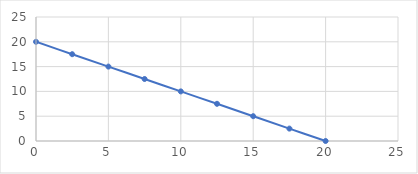
| Category | cereja |
|---|---|
| 20.0 | 0 |
| 17.5 | 2.5 |
| 15.0 | 5 |
| 12.5 | 7.5 |
| 10.0 | 10 |
| 7.5 | 12.5 |
| 5.0 | 15 |
| 2.5 | 17.5 |
| 0.0 | 20 |